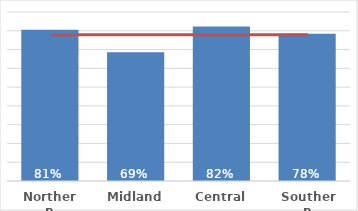
| Category | Dep 5 |
|---|---|
| Northern | 0.805 |
| Midland | 0.686 |
| Central | 0.823 |
| Southern | 0.784 |